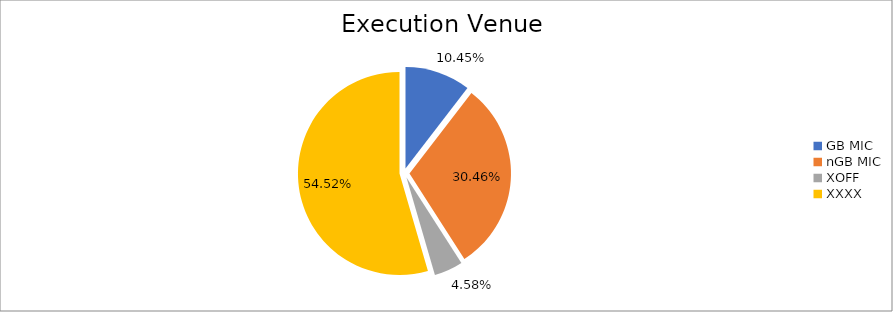
| Category | Series 0 |
|---|---|
| GB MIC | 735770.011 |
| nGB MIC | 2145541.278 |
| XOFF | 322276.609 |
| XXXX | 3840027.955 |